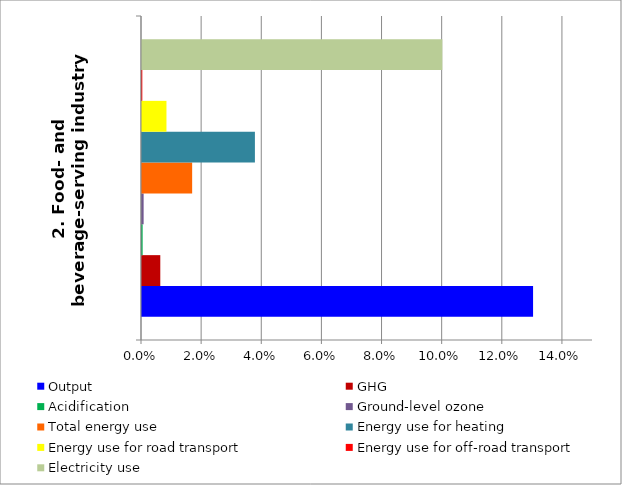
| Category | Output | GHG | Acidification | Ground-level ozone | Total energy use | Energy use for heating | Energy use for road transport | Energy use for off-road transport | Electricity use |
|---|---|---|---|---|---|---|---|---|---|
| 2. Food- and beverage-serving industry | 0.13 | 0.006 | 0 | 0.001 | 0.017 | 0.038 | 0.008 | 0 | 0.1 |